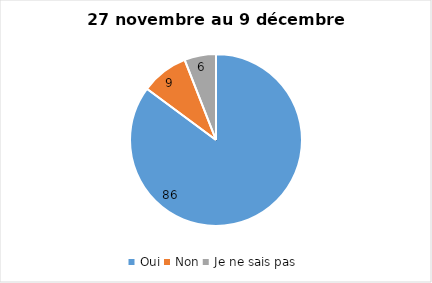
| Category | Series 0 |
|---|---|
| Oui | 86 |
| Non | 9 |
| Je ne sais pas | 6 |